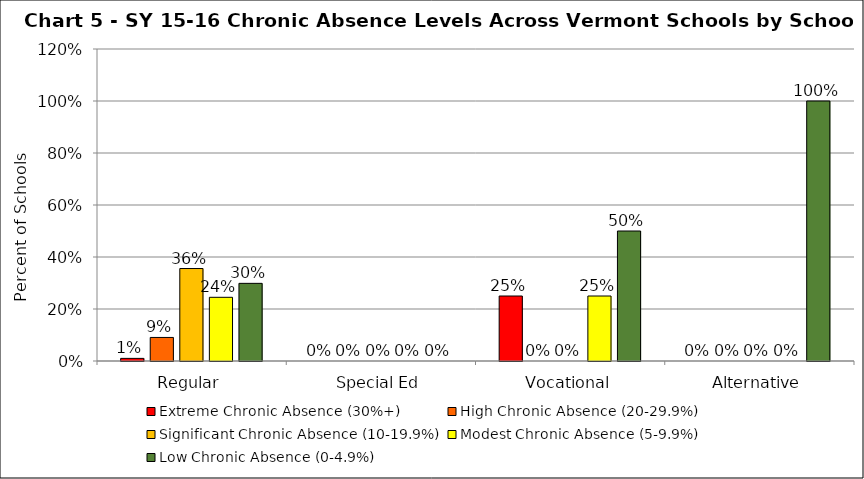
| Category | Extreme Chronic Absence (30%+) | High Chronic Absence (20-29.9%) | Significant Chronic Absence (10-19.9%) | Modest Chronic Absence (5-9.9%) | Low Chronic Absence (0-4.9%) |
|---|---|---|---|---|---|
| 0 | 0.01 | 0.091 | 0.356 | 0.245 | 0.299 |
| 1 | 0 | 0 | 0 | 0 | 0 |
| 2 | 0.25 | 0 | 0 | 0.25 | 0.5 |
| 3 | 0 | 0 | 0 | 0 | 1 |